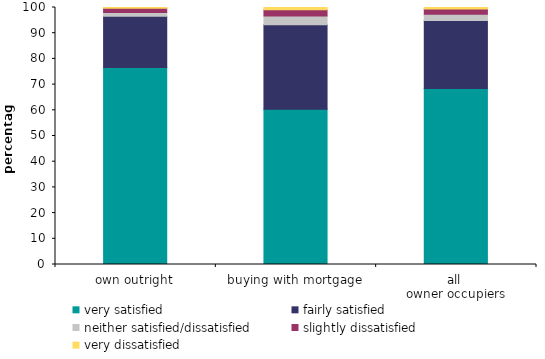
| Category | very satisfied | fairly satisfied | neither satisfied/dissatisfied | slightly dissatisfied | very dissatisfied |
|---|---|---|---|---|---|
| own outright | 76.62 | 20 | 1.465 | 1.616 | 0.299 |
| buying with mortgage | 60.434 | 32.847 | 3.391 | 2.469 | 0.859 |
| all 
owner occupiers | 68.514 | 26.433 | 2.43 | 2.043 | 0.579 |